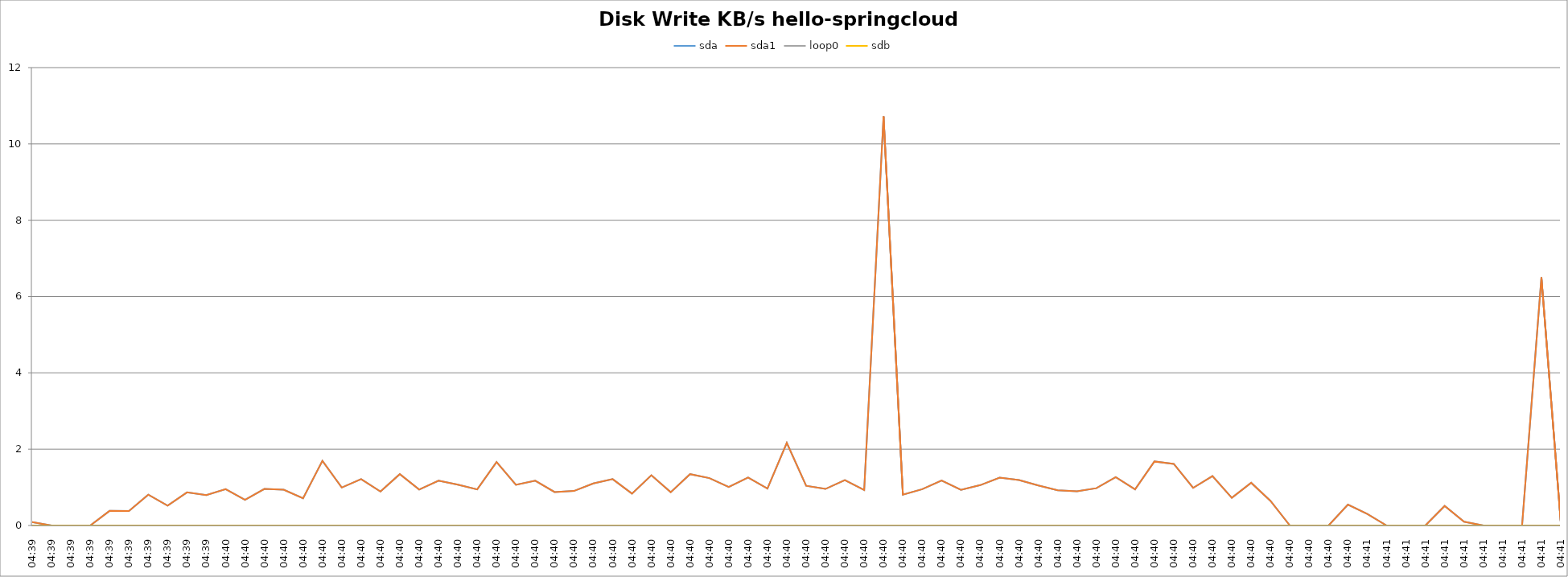
| Category | sda | sda1 | loop0 | sdb |
|---|---|---|---|---|
| 04:39 | 87.8 | 87.8 | 0 | 0 |
| 04:39 | 0 | 0 | 0 | 0 |
| 04:39 | 0 | 0 | 0 | 0 |
| 04:39 | 0 | 0 | 0 | 0 |
| 04:39 | 383.2 | 383.2 | 0 | 0 |
| 04:39 | 380.3 | 380.3 | 0 | 0 |
| 04:39 | 807.6 | 807.6 | 0 | 0 |
| 04:39 | 519.4 | 519.4 | 0 | 0 |
| 04:39 | 868.2 | 868.2 | 0 | 0 |
| 04:39 | 797.7 | 797.7 | 0 | 0 |
| 04:40 | 954.1 | 954.1 | 0 | 0 |
| 04:40 | 670.2 | 670.2 | 0 | 0 |
| 04:40 | 958.9 | 958.9 | 0 | 0 |
| 04:40 | 938.3 | 938.3 | 0 | 0 |
| 04:40 | 712.4 | 712.4 | 0 | 0 |
| 04:40 | 1695.8 | 1695.8 | 0 | 0 |
| 04:40 | 995.5 | 995.5 | 0 | 0 |
| 04:40 | 1216 | 1216 | 0 | 0 |
| 04:40 | 890.2 | 890.2 | 0 | 0 |
| 04:40 | 1346.4 | 1346.4 | 0 | 0 |
| 04:40 | 940.5 | 940.5 | 0 | 0 |
| 04:40 | 1175.4 | 1175.4 | 0 | 0 |
| 04:40 | 1068.3 | 1068.3 | 0 | 0 |
| 04:40 | 945.8 | 945.8 | 0 | 0 |
| 04:40 | 1662.5 | 1662.5 | 0 | 0 |
| 04:40 | 1066 | 1066 | 0 | 0 |
| 04:40 | 1175 | 1175 | 0 | 0 |
| 04:40 | 876.2 | 876.2 | 0 | 0 |
| 04:40 | 904.5 | 904.5 | 0 | 0 |
| 04:40 | 1102 | 1102 | 0 | 0 |
| 04:40 | 1215.3 | 1215.3 | 0 | 0 |
| 04:40 | 835.2 | 835.2 | 0 | 0 |
| 04:40 | 1317.5 | 1317.5 | 0 | 0 |
| 04:40 | 872.6 | 872.6 | 0 | 0 |
| 04:40 | 1346.4 | 1346.4 | 0 | 0 |
| 04:40 | 1241.7 | 1241.7 | 0 | 0 |
| 04:40 | 1006.7 | 1006.7 | 0 | 0 |
| 04:40 | 1256.4 | 1256.4 | 0 | 0 |
| 04:40 | 967.6 | 967.6 | 0 | 0 |
| 04:40 | 2165.8 | 2165.8 | 0 | 0 |
| 04:40 | 1041.3 | 1041.3 | 0 | 0 |
| 04:40 | 958.2 | 958.2 | 0 | 0 |
| 04:40 | 1187.4 | 1187.4 | 0 | 0 |
| 04:40 | 930.1 | 930.1 | 0 | 0 |
| 04:40 | 10721.2 | 10721.2 | 0 | 0 |
| 04:40 | 805.4 | 805.4 | 0 | 0 |
| 04:40 | 951.7 | 951.7 | 0 | 0 |
| 04:40 | 1179.6 | 1179.6 | 0 | 0 |
| 04:40 | 934.2 | 934.2 | 0 | 0 |
| 04:40 | 1058.3 | 1058.3 | 0 | 0 |
| 04:40 | 1254.3 | 1254.3 | 0 | 0 |
| 04:40 | 1191.4 | 1191.4 | 0 | 0 |
| 04:40 | 1050.9 | 1050.9 | 0 | 0 |
| 04:40 | 924.5 | 924.5 | 0 | 0 |
| 04:40 | 895.7 | 895.7 | 0 | 0 |
| 04:40 | 977.8 | 977.8 | 0 | 0 |
| 04:40 | 1266.9 | 1266.9 | 0 | 0 |
| 04:40 | 946.7 | 946.7 | 0 | 0 |
| 04:40 | 1678.2 | 1678.2 | 0 | 0 |
| 04:40 | 1613.9 | 1613.9 | 0 | 0 |
| 04:40 | 986 | 986 | 0 | 0 |
| 04:40 | 1295.2 | 1295.2 | 0 | 0 |
| 04:40 | 726.4 | 726.4 | 0 | 0 |
| 04:40 | 1119.5 | 1119.5 | 0 | 0 |
| 04:40 | 645.2 | 645.2 | 0 | 0 |
| 04:40 | 0 | 0 | 0 | 0 |
| 04:40 | 0 | 0 | 0 | 0 |
| 04:40 | 0 | 0 | 0 | 0 |
| 04:40 | 547.3 | 547.3 | 0 | 0 |
| 04:41 | 301.7 | 301.7 | 0 | 0 |
| 04:41 | 0 | 0 | 0 | 0 |
| 04:41 | 0 | 0 | 0 | 0 |
| 04:41 | 0 | 0 | 0 | 0 |
| 04:41 | 513 | 513 | 0 | 0 |
| 04:41 | 99.4 | 99.4 | 0 | 0 |
| 04:41 | 0 | 0 | 0 | 0 |
| 04:41 | 0 | 0 | 0 | 0 |
| 04:41 | 0 | 0 | 0 | 0 |
| 04:41 | 6503.4 | 6503.4 | 0 | 0 |
| 04:41 | 91.4 | 91.4 | 0 | 0 |